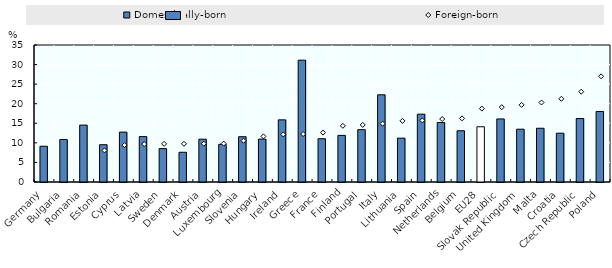
| Category | Domestically-born |
|---|---|
| Germany | 9.132 |
| Bulgaria | 10.847 |
| Romania | 14.532 |
| Estonia | 9.528 |
| Cyprus | 12.749 |
| Latvia | 11.603 |
| Sweden | 8.536 |
| Denmark | 7.595 |
| Austria | 10.935 |
| Luxembourg | 9.621 |
| Slovenia | 11.572 |
| Hungary | 10.957 |
| Ireland | 15.882 |
| Greece | 31.122 |
| France | 11.051 |
| Finland | 11.905 |
| Portugal | 13.371 |
| Italy | 22.28 |
| Lithuania | 11.207 |
| Spain | 17.33 |
| Netherlands | 15.191 |
| Belgium | 13.093 |
| EU28 | 14.114 |
| Slovak Republic | 16.107 |
| United Kingdom | 13.491 |
| Malta | 13.732 |
| Croatia | 12.47 |
| Czech Republic | 16.211 |
| Poland | 18.016 |